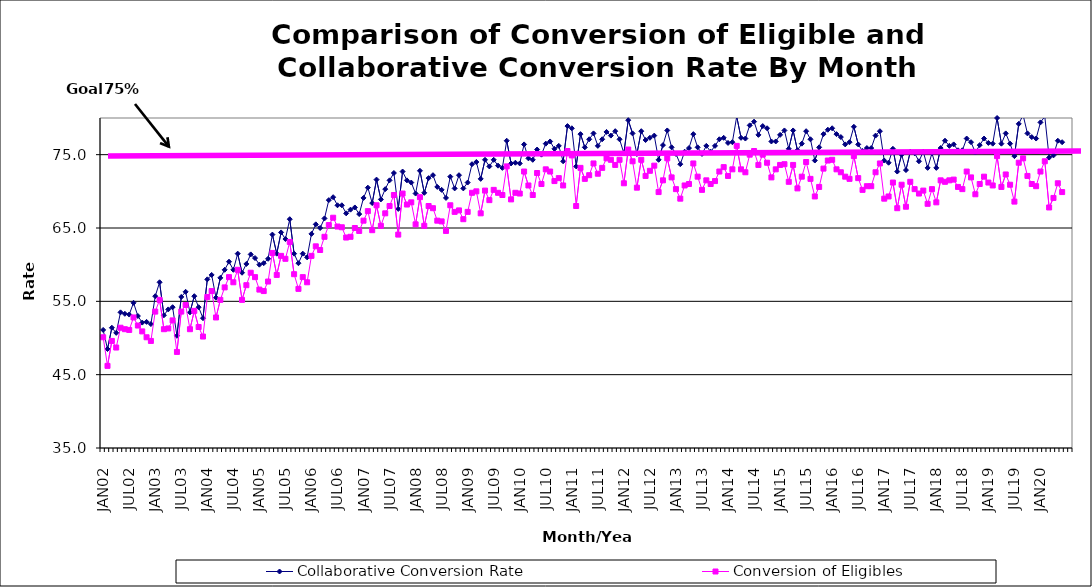
| Category | Collaborative Conversion Rate | Conversion of Eligibles |
|---|---|---|
| JAN02 | 51.1 | 50.1 |
| FEB02 | 48.5 | 46.2 |
| MAR02 | 51.4 | 49.6 |
| APR02 | 50.7 | 48.7 |
| MAY02 | 53.5 | 51.4 |
| JUN02 | 53.3 | 51.2 |
| JUL02 | 53.2 | 51.1 |
| AUG02 | 54.8 | 52.8 |
| SEP02 | 53 | 51.7 |
| OCT02 | 52.1 | 50.9 |
| NOV02 | 52.2 | 50.1 |
| DEC02 | 51.9 | 49.6 |
| JAN03 | 55.7 | 53.6 |
| FEB03 | 57.6 | 55.2 |
| MAR03 | 53.1 | 51.2 |
| APR03 | 53.9 | 51.3 |
| MAY03 | 54.2 | 52.4 |
| JUN03 | 50.3 | 48.1 |
| JUL03 | 55.6 | 53.6 |
| AUG03 | 56.3 | 54.5 |
| SEP03 | 53.5 | 51.2 |
| OCT03 | 55.7 | 53.7 |
| NOV03 | 54.2 | 51.5 |
| DEC03 | 52.7 | 50.2 |
| JAN04 | 58 | 55.6 |
| FEB04 | 58.6 | 56.4 |
| MAR04 | 55.5 | 52.8 |
| APR04 | 58.2 | 55.2 |
| MAY04 | 59.3 | 56.9 |
| JUN04 | 60.4 | 58.3 |
| JUL04 | 59.3 | 57.6 |
| AUG04 | 61.5 | 59.3 |
| SEP04 | 58.9 | 55.2 |
| OCT04 | 60.1 | 57.2 |
| NOV04 | 61.4 | 58.9 |
| DEC04 | 60.9 | 58.3 |
| JAN05 | 60 | 56.6 |
| FEB05 | 60.2 | 56.4 |
| MAR05 | 60.8 | 57.7 |
| APR05 | 64.1 | 61.6 |
| MAY05 | 61.5 | 58.6 |
| JUN05 | 64.4 | 61.2 |
| JUL05 | 63.5 | 60.8 |
| AUG05 | 66.2 | 63.1 |
| SEP05 | 61.5 | 58.7 |
| OCT05 | 60.2 | 56.7 |
| NOV05 | 61.5 | 58.3 |
| DEC05 | 61 | 57.6 |
| JAN06 | 64.2 | 61.2 |
| FEB06 | 65.5 | 62.5 |
| MAR06 | 65 | 62 |
| APR06 | 66.3 | 63.8 |
| MAY06 | 68.8 | 65.4 |
| JUN06 | 69.2 | 66.4 |
| JUL06 | 68.1 | 65.2 |
| AUG06 | 68.1 | 65.1 |
| SEP06 | 67 | 63.7 |
| OCT06 | 67.5 | 63.8 |
| NOV06 | 67.8 | 65 |
| DEC06 | 66.9 | 64.6 |
| JAN07 | 69.1 | 66 |
| FEB07 | 70.5 | 67.3 |
| MAR07 | 68.4 | 64.7 |
| APR07 | 71.6 | 68.1 |
| MAY07 | 68.9 | 65.3 |
| JUN07 | 70.3 | 67 |
| JUL07 | 71.5 | 68 |
| AUG07 | 72.5 | 69.5 |
| SEP07 | 67.6 | 64.1 |
| OCT07 | 72.7 | 69.7 |
| NOV07 | 71.5 | 68.2 |
| DEC07 | 71.2 | 68.5 |
| JAN08 | 69.7 | 65.5 |
| FEB08 | 72.8 | 69.2 |
| MAR08 | 69.8 | 65.3 |
| APR08 | 71.8 | 68 |
| MAY08 | 72.2 | 67.7 |
| JUN08 | 70.6 | 66 |
| JUL08 | 70.2 | 65.9 |
| AUG08 | 69.1 | 64.6 |
| SEP08 | 72 | 68.1 |
| OCT08 | 70.4 | 67.2 |
| NOV08 | 72.2 | 67.4 |
| DEC08 | 70.4 | 66.2 |
| JAN09 | 71.2 | 67.2 |
| FEB09 | 73.7 | 69.8 |
| MAR09 | 74 | 70 |
| APR09 | 71.7 | 67 |
| MAY09 | 74.3 | 70.1 |
| JUN09 | 73.4 | 68.8 |
| JUL09 | 74.3 | 70.2 |
| AUG09 | 73.5 | 69.8 |
| SEP09 | 73.2 | 69.5 |
| OCT09 | 76.9 | 73.4 |
| NOV09 | 73.8 | 68.9 |
| DEC09 | 73.9 | 69.8 |
| JAN10 | 73.8 | 69.7 |
| FEB10 | 76.4 | 72.7 |
| MAR10 | 74.5 | 70.8 |
| APR10 | 74.3 | 69.5 |
| MAY10 | 75.7 | 72.5 |
| JUN10 | 75 | 71 |
| JUL10 | 76.5 | 73 |
| AUG10 | 76.8 | 72.7 |
| SEP10 | 75.8 | 71.4 |
| OCT10 | 76.2 | 71.8 |
| NOV10 | 74.1 | 70.8 |
| DEC10 | 78.9 | 75.5 |
| JAN11 | 78.6 | 74.9 |
| FEB11 | 73.4 | 68 |
| MAR11 | 77.8 | 73.2 |
| APR11 | 76 | 71.7 |
| MAY11 | 77.1 | 72.2 |
| JUN11 | 77.9 | 73.8 |
| JUL11 | 76.2 | 72.4 |
| AUG11 | 77.1 | 73.2 |
| SEP11 | 78.1 | 74.5 |
| OCT11 | 77.6 | 74.3 |
| NOV11 | 78.2 | 73.6 |
| DEC11 | 77.1 | 74.3 |
| JAN12 | 75.2 | 71.1 |
| FEB12 | 79.7 | 75.7 |
| MAR12 | 77.9 | 74.1 |
| APR12 | 75.1 | 70.5 |
| MAY12 | 78.2 | 74.3 |
| JUN12 | 77 | 72.1 |
| JUL12 | 77.3 | 72.8 |
| AUG12 | 77.6 | 73.5 |
| SEP12 | 74.3 | 69.9 |
| OCT12 | 76.3 | 71.5 |
| NOV12 | 78.3 | 74.5 |
| DEC12 | 76 | 71.9 |
| JAN13 | 75.1 | 70.3 |
| FEB13 | 73.7 | 69 |
| MAR13 | 75.4 | 70.8 |
| APR13 | 75.9 | 71 |
| MAY13 | 77.8 | 73.8 |
| JUN13 | 76 | 72 |
| JUL13 | 75.1 | 70.2 |
| AUG13 | 76.2 | 71.5 |
| SEP13 | 75.4 | 71 |
| OCT13 | 76.2 | 71.4 |
| NOV13 | 77.1 | 72.7 |
| DEC13 | 77.3 | 73.3 |
| JAN14 | 76.6 | 72.1 |
| FEB14 | 76.7 | 73 |
| MAR14 | 80.2 | 76.2 |
| APR14 | 77.3 | 73 |
| MAY14 | 77.2 | 72.6 |
| JUN14 | 79 | 75 |
| JUL14 | 79.5 | 75.5 |
| AUG14 | 77.7 | 73.6 |
| SEP14 | 78.9 | 75 |
| OCT14 | 78.6 | 73.9 |
| NOV14 | 76.8 | 71.9 |
| DEC14 | 76.8 | 73 |
| JAN15 | 77.7 | 73.6 |
| FEB15 | 78.3 | 73.7 |
| MAR15 | 75.8 | 71.3 |
| APR15 | 78.3 | 73.6 |
| MAY15 | 75.6 | 70.4 |
| JUN15 | 76.5 | 72 |
| JUL15 | 78.2 | 74 |
| AUG15 | 77.1 | 71.7 |
| SEP15 | 74.2 | 69.3 |
| OCT15 | 76 | 70.6 |
| NOV15 | 77.8 | 73.1 |
| DEC15 | 78.4 | 74.2 |
| JAN16 | 78.6 | 74.3 |
| FEB16 | 77.8 | 73 |
| MAR16 | 77.4 | 72.6 |
| APR16 | 76.4 | 72 |
| MAY16 | 76.7 | 71.7 |
| JUN16 | 78.8 | 74.8 |
| JUL16 | 76.4 | 71.8 |
| AUG16 | 75.5 | 70.2 |
| SEP16 | 75.9 | 70.7 |
| OCT16 | 75.9 | 70.7 |
| NOV16 | 77.6 | 72.6 |
| DEC16 | 78.2 | 73.8 |
| JAN17 | 74.2 | 69 |
| FEB17 | 73.9 | 69.3 |
| MAR17 | 75.8 | 71.2 |
| APR17 | 72.7 | 67.7 |
| MAY17 | 75 | 70.9 |
| JUN17 | 72.9 | 67.9 |
| JUL17 | 75.4 | 71.3 |
| AUG17 | 75.2 | 70.3 |
| SEP17 | 74.1 | 69.7 |
| OCT17 | 75.4 | 70.1 |
| NOV17 | 73.2 | 68.3 |
| DEC17 | 75.2 | 70.3 |
| JAN18 | 73.2 | 68.5 |
| FEB18 | 75.9 | 71.5 |
| MAR18 | 76.9 | 71.3 |
| APR18 | 76.2 | 71.5 |
| MAY18 | 76.4 | 71.6 |
| JUN18 | 75.6 | 70.6 |
| JUL18 | 75.6 | 70.3 |
| AUG18 | 77.2 | 72.7 |
| SEP18 | 76.7 | 71.9 |
| OCT18 | 75.3 | 69.6 |
| NOV18 | 76.3 | 71 |
| DEC18 | 77.2 | 72 |
| JAN19 | 76.6 | 71.2 |
| FEB19 | 76.5 | 70.8 |
| MAR19 | 80 | 74.8 |
| APR19 | 76.5 | 70.6 |
| MAY19 | 77.9 | 72.3 |
| JUN19 | 76.5 | 70.9 |
| JUL19 | 74.8 | 68.6 |
| AUG19 | 79.2 | 73.9 |
| SEP19 | 80.4 | 74.5 |
| OCT19 | 77.9 | 72.1 |
| NOV19 | 77.4 | 71 |
| DEC19 | 77.2 | 70.7 |
| JAN20 | 79.4 | 72.7 |
| FEB20 | 80.2 | 74.1 |
| MAR20 | 74.6 | 67.8 |
| APR20 | 74.9 | 69.1 |
| MAY20 | 76.9 | 71.1 |
| JUN20 | 76.7 | 69.9 |